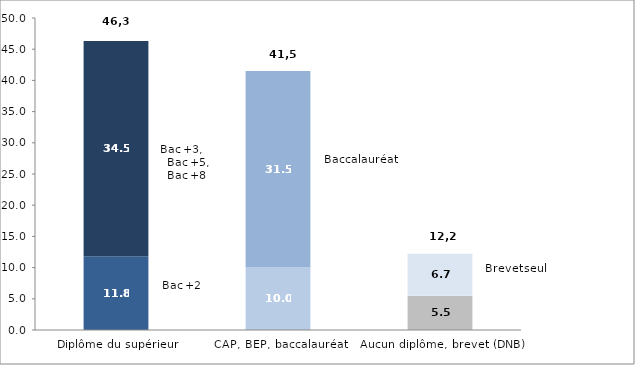
| Category | Series 0 | Series 1 |
|---|---|---|
| Diplôme du supérieur | 11.8 | 34.5 |
| CAP, BEP, baccalauréat | 10 | 31.5 |
| Aucun diplôme, brevet (DNB) | 5.5 | 6.7 |